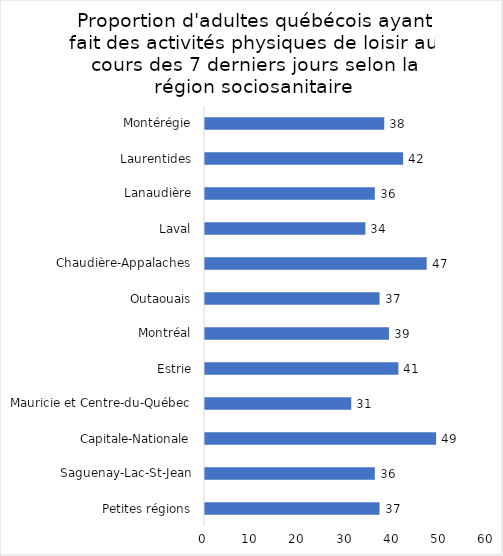
| Category | Series 0 |
|---|---|
| Petites régions | 37 |
| Saguenay-Lac-St-Jean | 36 |
| Capitale-Nationale | 49 |
| Mauricie et Centre-du-Québec | 31 |
| Estrie | 41 |
| Montréal | 39 |
| Outaouais | 37 |
| Chaudière-Appalaches | 47 |
| Laval | 34 |
| Lanaudière | 36 |
| Laurentides | 42 |
| Montérégie | 38 |